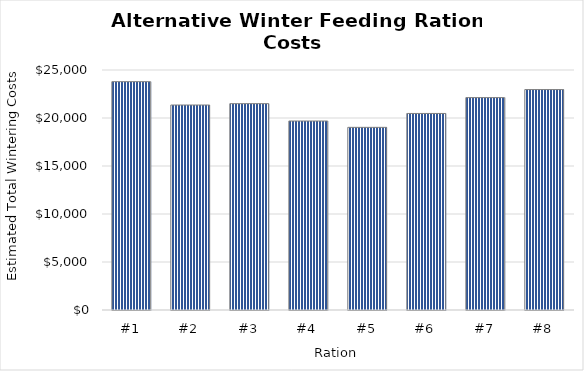
| Category | Series 0 |
|---|---|
| #1 | 23785.544 |
| #2 | 21352.381 |
| #3 | 21494.558 |
| #4 | 19685.034 |
| #5 | 19025.85 |
| #6 | 20473.469 |
| #7 | 22124.66 |
| #8 | 22963.18 |